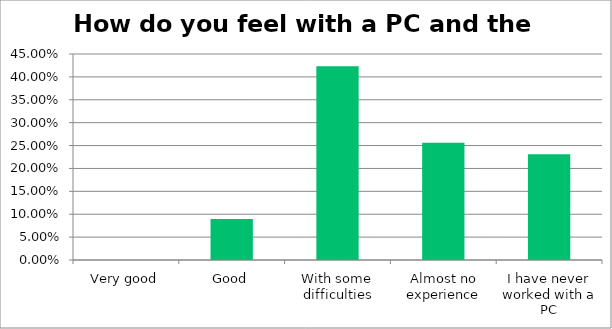
| Category | Responses |
|---|---|
| Very good | 0 |
| Good | 0.09 |
| With some difficulties | 0.423 |
| Almost no experience | 0.256 |
| I have never worked with a PC | 0.231 |